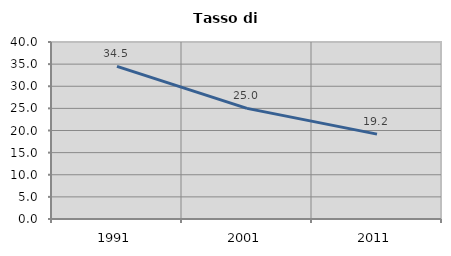
| Category | Tasso di disoccupazione   |
|---|---|
| 1991.0 | 34.503 |
| 2001.0 | 24.997 |
| 2011.0 | 19.179 |